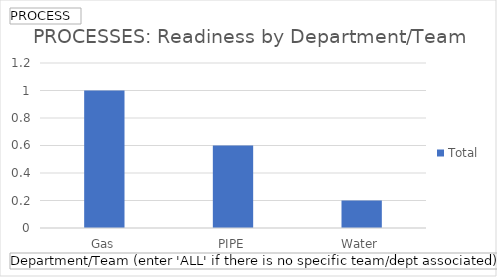
| Category | Total |
|---|---|
| Gas | 1 |
| PIPE | 0.6 |
| Water | 0.2 |